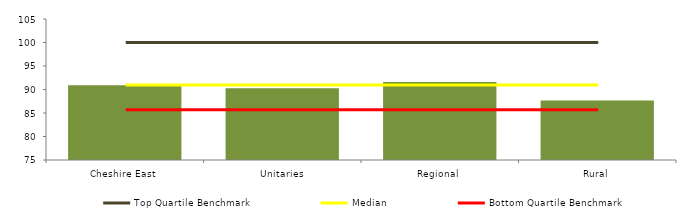
| Category | Block Data |
|---|---|
| Cheshire East | 90.909 |
| Unitaries | 90.245 |
| Regional | 91.569 |
|  Rural  | 87.643 |